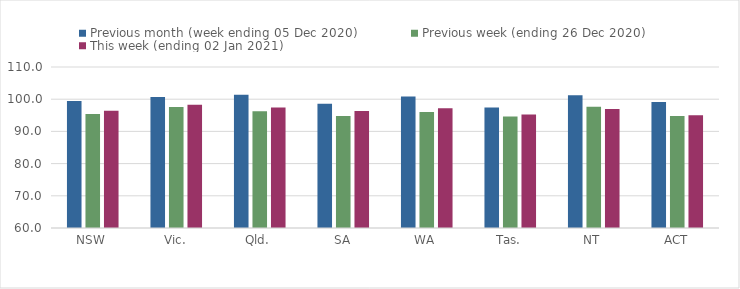
| Category | Previous month (week ending 05 Dec 2020) | Previous week (ending 26 Dec 2020) | This week (ending 02 Jan 2021) |
|---|---|---|---|
| NSW | 99.44 | 95.38 | 96.43 |
| Vic. | 100.65 | 97.61 | 98.27 |
| Qld. | 101.4 | 96.26 | 97.44 |
| SA | 98.58 | 94.81 | 96.35 |
| WA | 100.83 | 96.05 | 97.2 |
| Tas. | 97.44 | 94.64 | 95.23 |
| NT | 101.24 | 97.64 | 96.99 |
| ACT | 99.14 | 94.82 | 94.99 |